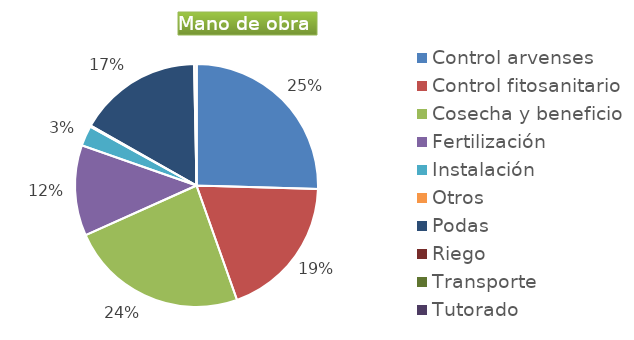
| Category | Series 0 |
|---|---|
| Control arvenses | 32544697 |
| Control fitosanitario | 24459480 |
| Cosecha y beneficio | 30318000 |
| Fertilización | 15423061 |
| Instalación | 3434897 |
| Otros | 203829 |
| Podas | 21062330 |
| Riego | 407658 |
| Transporte | 0 |
| Tutorado | 0 |